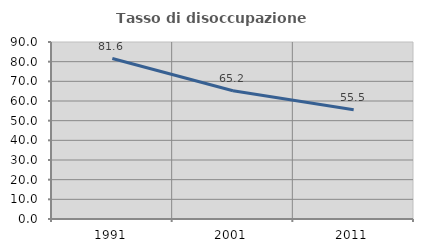
| Category | Tasso di disoccupazione giovanile  |
|---|---|
| 1991.0 | 81.583 |
| 2001.0 | 65.236 |
| 2011.0 | 55.528 |